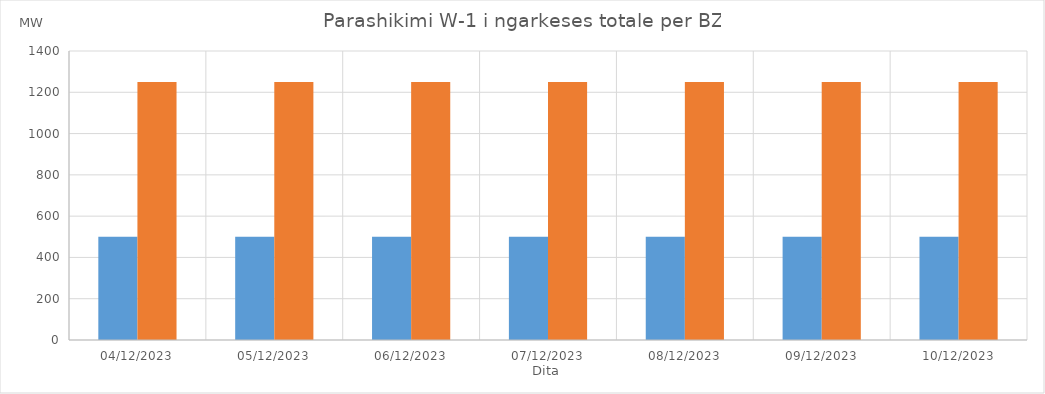
| Category | Min (MW) | Max (MW) |
|---|---|---|
| 04/12/2023 | 500 | 1250 |
| 05/12/2023 | 500 | 1250 |
| 06/12/2023 | 500 | 1250 |
| 07/12/2023 | 500 | 1250 |
| 08/12/2023 | 500 | 1250 |
| 09/12/2023 | 500 | 1250 |
| 10/12/2023 | 500 | 1250 |